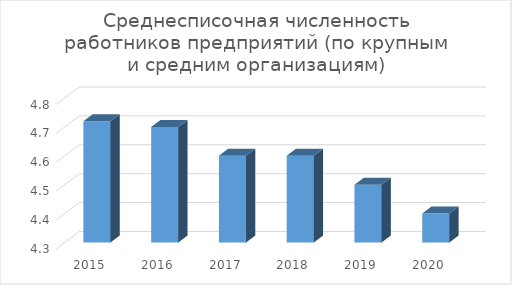
| Category | Среднесписочная численность работников предприятий (по крупным и средним организациям) |
|---|---|
| 2015.0 | 4.72 |
| 2016.0 | 4.7 |
| 2017.0 | 4.6 |
| 2018.0 | 4.6 |
| 2019.0 | 4.5 |
| 2020.0 | 4.4 |